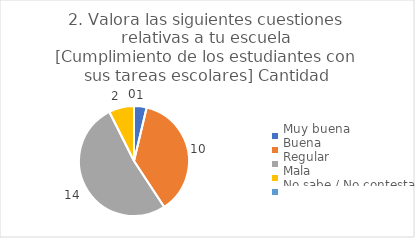
| Category | 2. Valora las siguientes cuestiones relativas a tu escuela
[Cumplimiento de los estudiantes con sus tareas escolares] |
|---|---|
| Muy buena  | 0.037 |
| Buena  | 0.37 |
| Regular  | 0.519 |
| Mala  | 0.074 |
| No sabe / No contesta | 0 |